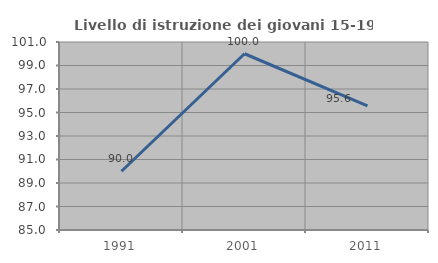
| Category | Livello di istruzione dei giovani 15-19 anni |
|---|---|
| 1991.0 | 90 |
| 2001.0 | 100 |
| 2011.0 | 95.556 |